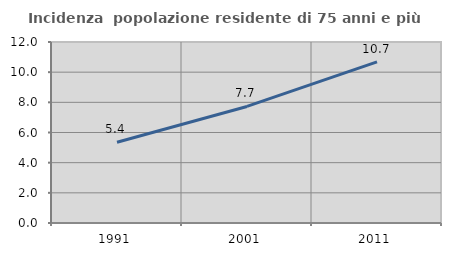
| Category | Incidenza  popolazione residente di 75 anni e più |
|---|---|
| 1991.0 | 5.357 |
| 2001.0 | 7.728 |
| 2011.0 | 10.683 |